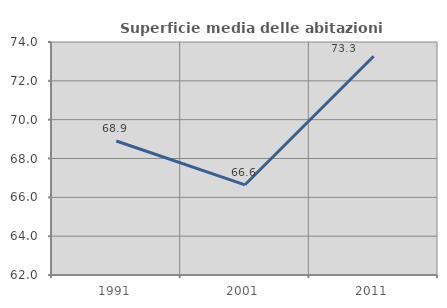
| Category | Superficie media delle abitazioni occupate |
|---|---|
| 1991.0 | 68.902 |
| 2001.0 | 66.646 |
| 2011.0 | 73.267 |